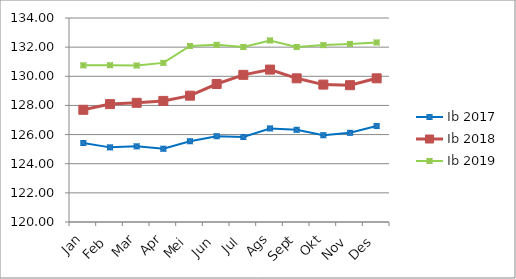
| Category | Ib 2017 | Ib 2018 | Ib 2019 |
|---|---|---|---|
| Jan | 125.42 | 127.7 | 130.75 |
| Feb | 125.122 | 128.09 | 130.76 |
| Mar | 125.192 | 128.18 | 130.74 |
| Apr | 125.027 | 128.31 | 130.92 |
| Mei | 125.543 | 128.67 | 132.08 |
| Jun | 125.888 | 129.47 | 132.16 |
| Jul | 125.836 | 130.1 | 132.01 |
| Ags | 126.422 | 130.46 | 132.46 |
| Sept | 126.327 | 129.86 | 132.01 |
| Okt | 125.956 | 129.43 | 132.14 |
| Nov | 126.12 | 129.39 | 132.22 |
| Des | 126.585 | 129.86 | 132.32 |